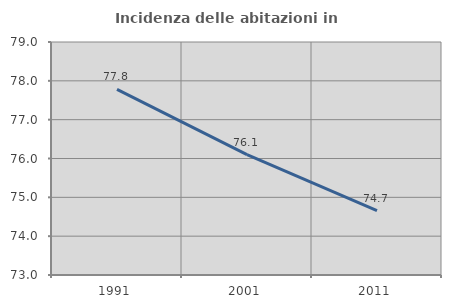
| Category | Incidenza delle abitazioni in proprietà  |
|---|---|
| 1991.0 | 77.778 |
| 2001.0 | 76.098 |
| 2011.0 | 74.658 |